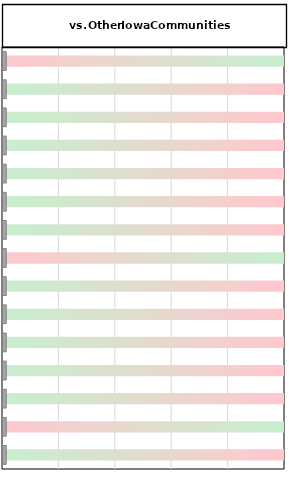
| Category | Spectrum |
|---|---|
| Median Household Income (MHI) | 10 |
| Percent Below Poverty Level | 10 |
| Percent Receiving Public Assistance or SNAP | 10 |
| Percent Receiving Supplemental Security Income | 10 |
| Unemployment Rate (Primary County 12 mo avg) | 10 |
| Percent Not in Labor Force | 10 |
| Percent over Age 65 | 10 |
| Population Trend (2010-2020) | 10 |
| Percent with High School Diploma or Less | 10 |
| Percent of Vacant Homes (excl. Seasonal and Vacation) | 10 |
| Percent Housing Cost Burdened (>= 30% of Income) | 10 |
| Percent Minority | 10 |
| Social Vulnerability Index (Primary County) | 10 |
| Assessed Valuation/Capita | 10 |
| Outstanding Debt/Capita | 10 |